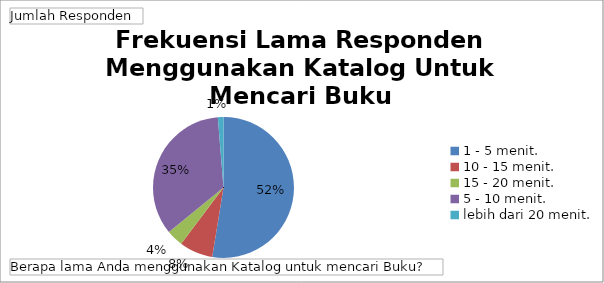
| Category | Total |
|---|---|
| 1 - 5 menit. | 41 |
| 10 - 15 menit. | 6 |
| 15 - 20 menit. | 3 |
| 5 - 10 menit. | 27 |
| lebih dari 20 menit. | 1 |